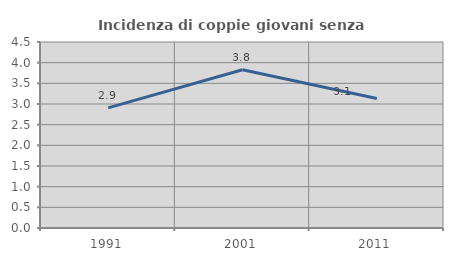
| Category | Incidenza di coppie giovani senza figli |
|---|---|
| 1991.0 | 2.907 |
| 2001.0 | 3.829 |
| 2011.0 | 3.132 |